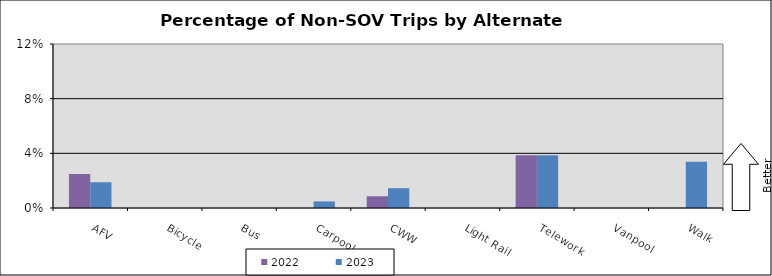
| Category | 2022 | 2023 |
|---|---|---|
| AFV | 0.025 | 0.019 |
| Bicycle | 0 | 0 |
| Bus | 0 | 0 |
| Carpool | 0 | 0.005 |
| CWW | 0.009 | 0.014 |
| Light Rail | 0 | 0 |
| Telework | 0.039 | 0.039 |
| Vanpool | 0 | 0 |
| Walk | 0 | 0.034 |